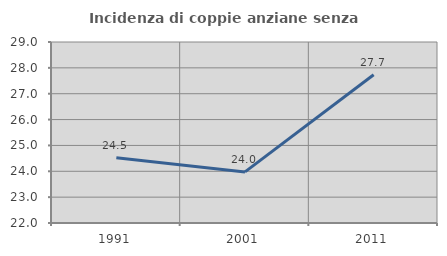
| Category | Incidenza di coppie anziane senza figli  |
|---|---|
| 1991.0 | 24.519 |
| 2001.0 | 23.977 |
| 2011.0 | 27.731 |